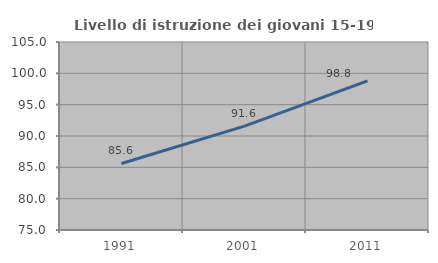
| Category | Livello di istruzione dei giovani 15-19 anni |
|---|---|
| 1991.0 | 85.616 |
| 2001.0 | 91.579 |
| 2011.0 | 98.81 |